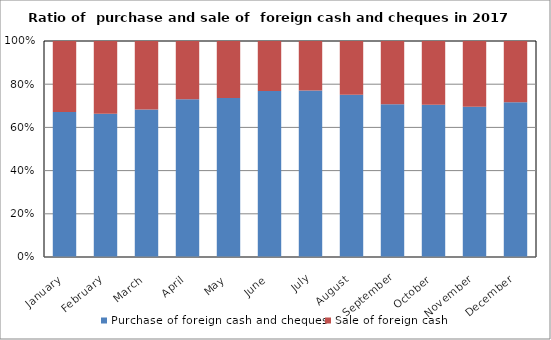
| Category | Purchase of foreign cash and cheques | Sale of foreign cash  |
|---|---|---|
| January | 969531897 | 473833501 |
| February | 1037926324 | 527519686 |
| March | 1327244279 | 616002822 |
| April | 1596858044 | 588010613 |
| May | 1758302582 | 630286548 |
| June | 2385575927 | 718069690 |
| July | 3297079135 | 982081078 |
| August | 3538818501 | 1169008844 |
| September | 1939379435 | 804133925 |
| October | 1540007324 | 645068692 |
| November | 1274822036 | 557216569 |
| December | 1319520976 | 523576348 |